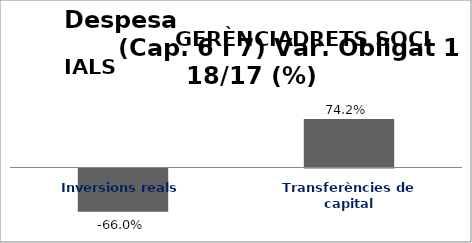
| Category | Series 0 |
|---|---|
| Inversions reals | -0.66 |
| Transferències de capital | 0.742 |